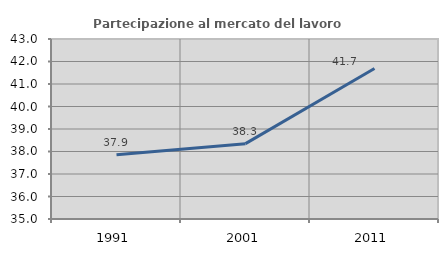
| Category | Partecipazione al mercato del lavoro  femminile |
|---|---|
| 1991.0 | 37.854 |
| 2001.0 | 38.348 |
| 2011.0 | 41.688 |